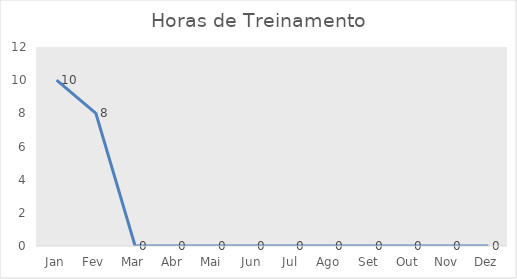
| Category | Horas de Treinamento |
|---|---|
| Jan | 10 |
| Fev | 8 |
| Mar | 0 |
| Abr | 0 |
| Mai | 0 |
| Jun | 0 |
| Jul | 0 |
| Ago | 0 |
| Set | 0 |
| Out | 0 |
| Nov | 0 |
| Dez | 0 |